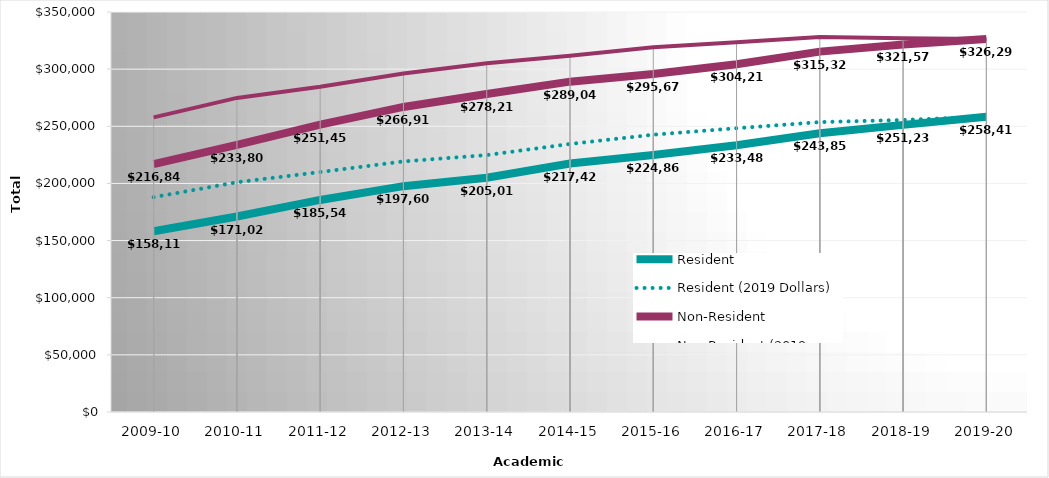
| Category | Resident | Resident (2019 Dollars) | Non-Resident | Non-Resident (2019 Dollars) |
|---|---|---|---|---|
| 2009-10 | 158119 | 187982.89 | 216842 | 257796.88 |
| 2010-11 | 171023 | 201024.97 | 233808 | 274824.13 |
| 2011-12 | 185545 | 209972.05 | 251457 | 284561.38 |
| 2012-13 | 197604 | 219252.68 | 266914 | 296156 |
| 2013-14 | 205010 | 224806.27 | 278217 | 305082.31 |
| 2014-15 | 217423 | 234529.59 | 289042 | 311783.49 |
| 2015-16 | 224860.11 | 242639.5 | 295678.13 | 319057.01 |
| 2016-17 | 233479.65 | 248305.92 | 304212.15 | 323530.03 |
| 2017-18 | 243850 | 253670.43 | 315322 | 328020.78 |
| 2018-19 | 251233 | 255532.36 | 321575 | 327078.13 |
| 2019-20 | 258412 | 258412 | 326294 | 326294 |